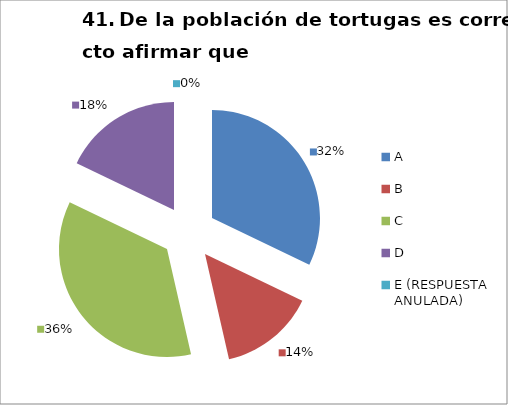
| Category | CANTIDAD DE RESPUESTAS PREGUNTA (41) | PORCENTAJE |
|---|---|---|
| A | 9 | 0.321 |
| B | 4 | 0.143 |
| C | 10 | 0.357 |
| D | 5 | 0.179 |
| E (RESPUESTA ANULADA) | 0 | 0 |